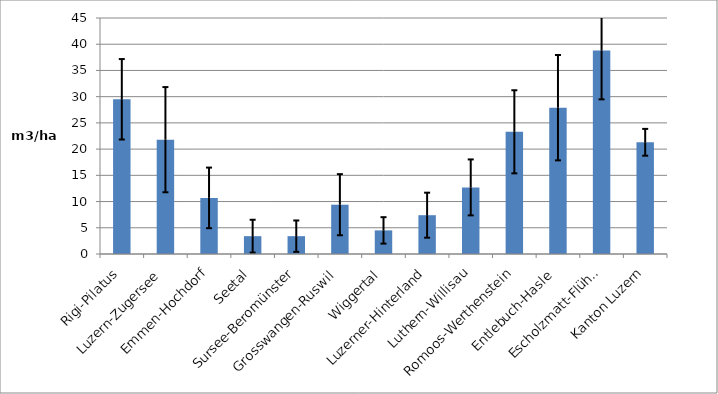
| Category | Series 0 |
|---|---|
| Rigi-Pilatus | 29.5 |
| Luzern-Zugersee | 21.8 |
| Emmen-Hochdorf | 10.7 |
| Seetal | 3.4 |
| Sursee-Beromünster | 3.4 |
| Grosswangen-Ruswil | 9.4 |
| Wiggertal | 4.5 |
| Luzerner-Hinterland | 7.4 |
| Luthern-Willisau | 12.7 |
| Romoos-Werthenstein | 23.3 |
| Entlebuch-Hasle | 27.9 |
| Escholzmatt-Flühli | 38.8 |
| Kanton Luzern | 21.3 |